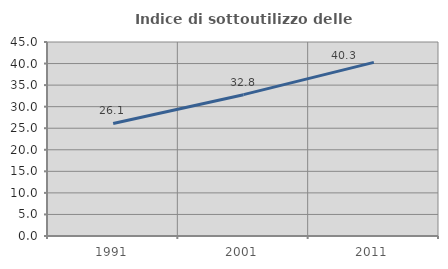
| Category | Indice di sottoutilizzo delle abitazioni  |
|---|---|
| 1991.0 | 26.115 |
| 2001.0 | 32.783 |
| 2011.0 | 40.267 |